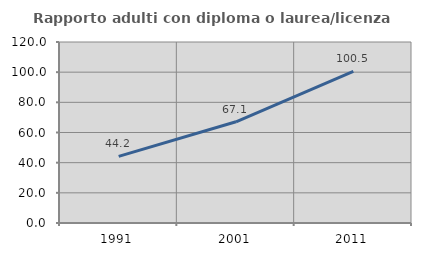
| Category | Rapporto adulti con diploma o laurea/licenza media  |
|---|---|
| 1991.0 | 44.18 |
| 2001.0 | 67.085 |
| 2011.0 | 100.519 |